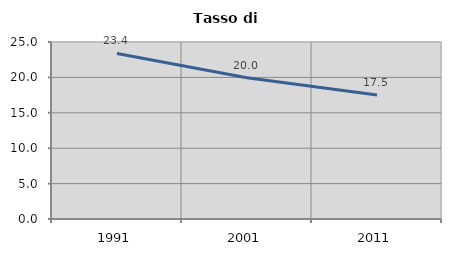
| Category | Tasso di disoccupazione   |
|---|---|
| 1991.0 | 23.379 |
| 2001.0 | 19.957 |
| 2011.0 | 17.52 |